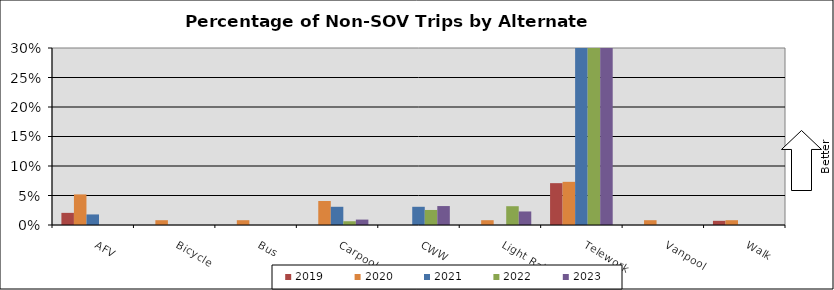
| Category | 2019 | 2020 | 2021 | 2022 | 2023 |
|---|---|---|---|---|---|
| AFV | 0.021 | 0.052 | 0.018 | 0 | 0 |
| Bicycle | 0 | 0.008 | 0 | 0 | 0 |
| Bus | 0 | 0.008 | 0 | 0 | 0 |
| Carpool | 0 | 0.041 | 0.031 | 0.006 | 0.009 |
| CWW | 0 | 0 | 0.031 | 0.025 | 0.032 |
| Light Rail | 0 | 0.008 | 0 | 0.032 | 0.023 |
| Telework | 0.071 | 0.073 | 0.574 | 0.49 | 0.518 |
| Vanpool | 0 | 0.008 | 0 | 0 | 0 |
| Walk | 0.007 | 0.008 | 0 | 0 | 0 |